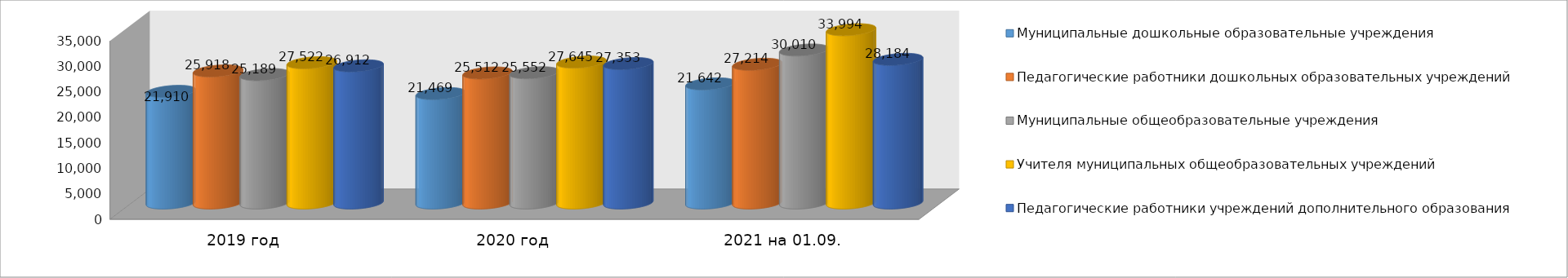
| Category | Муниципальные дошкольные образовательные учреждения | Педагогические работники дошкольных образовательных учреждений | Муниципальные общеобразовательные учреждения | Учителя муниципальных общеобразовательных учреждений | Педагогические работники учреждений дополнительного образования |
|---|---|---|---|---|---|
| 2019 год | 21910 | 25918 | 25189 | 27522 | 26912 |
| 2020 год | 21469 | 25512 | 25552 | 27645 | 27353 |
| 2021 на 01.09. | 23373 | 27214 | 30010 | 33994 | 28184 |